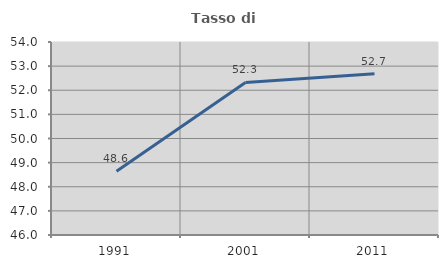
| Category | Tasso di occupazione   |
|---|---|
| 1991.0 | 48.641 |
| 2001.0 | 52.323 |
| 2011.0 | 52.682 |